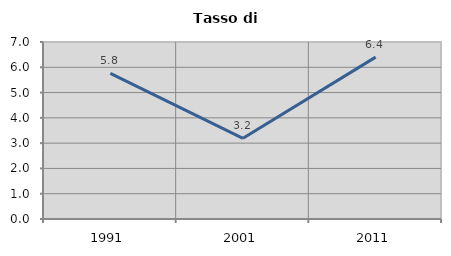
| Category | Tasso di disoccupazione   |
|---|---|
| 1991.0 | 5.761 |
| 2001.0 | 3.192 |
| 2011.0 | 6.402 |